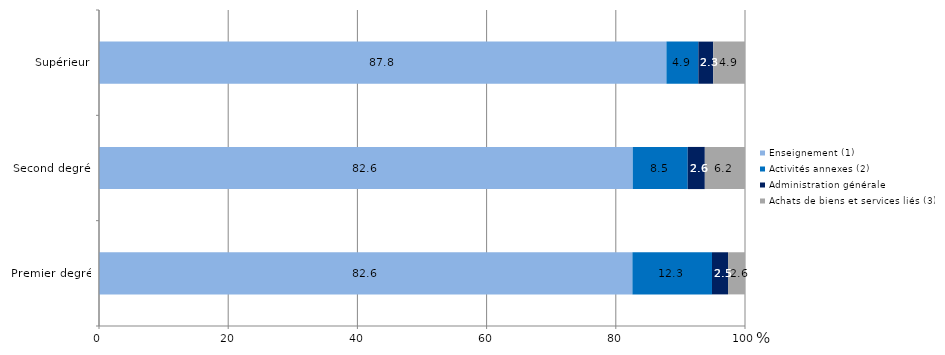
| Category | Enseignement (1) | Activités annexes (2) | Administration générale | Achats de biens et services liés (3) |
|---|---|---|---|---|
| Premier degré | 82.568 | 12.322 | 2.484 | 2.626 |
| Second degré | 82.621 | 8.511 | 2.648 | 6.22 |
| Supérieur | 87.835 | 4.944 | 2.302 | 4.918 |